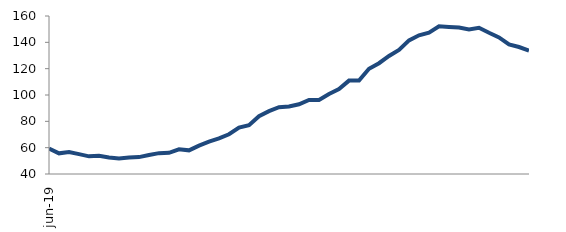
| Category | Series 0 |
|---|---|
| 2019-06-01 | 59.307 |
| 2019-07-01 | 55.7 |
| 2019-08-01 | 56.658 |
| 2019-09-01 | 55.107 |
| 2019-10-01 | 53.41 |
| 2019-11-01 | 53.924 |
| 2019-12-01 | 52.607 |
| 2020-01-01 | 51.869 |
| 2020-02-01 | 52.619 |
| 2020-03-01 | 52.83 |
| 2020-04-01 | 54.43 |
| 2020-05-01 | 55.851 |
| 2020-06-01 | 56.062 |
| 2020-07-01 | 58.766 |
| 2020-08-01 | 57.967 |
| 2020-09-01 | 61.563 |
| 2020-10-01 | 64.611 |
| 2020-11-01 | 67.053 |
| 2020-12-01 | 70.207 |
| 2021-01-01 | 75.283 |
| 2021-02-01 | 77.125 |
| 2021-03-01 | 83.917 |
| 2021-04-01 | 87.772 |
| 2021-05-01 | 90.698 |
| 2021-06-01 | 91.254 |
| 2021-07-01 | 92.957 |
| 2021-08-01 | 96.281 |
| 2021-09-01 | 96.228 |
| 2021-10-01 | 100.807 |
| 2021-11-01 | 104.506 |
| 2021-12-01 | 110.93 |
| 2022-01-01 | 110.966 |
| 2022-02-01 | 119.928 |
| 2022-03-01 | 124.133 |
| 2022-04-01 | 129.687 |
| 2022-05-01 | 134.267 |
| 2022-06-01 | 141.471 |
| 2022-07-01 | 145.357 |
| 2022-08-01 | 147.378 |
| 2022-09-01 | 152.132 |
| 2022-10-01 | 151.659 |
| 2022-11-01 | 151.229 |
| 2022-12-01 | 149.84 |
| 2023-01-01 | 151.047 |
| 2023-02-01 | 147.233 |
| 2023-03-01 | 143.736 |
| 2023-04-01 | 138.403 |
| 2023-05-01 | 136.434 |
| 2023-06-01 | 133.747 |